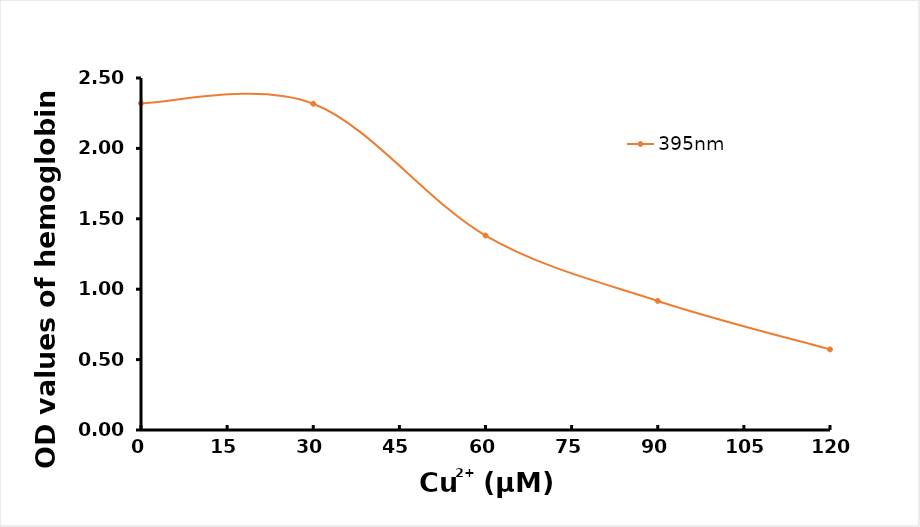
| Category | 395nm |
|---|---|
| 0.0 | 2.321 |
| 30.0 | 2.317 |
| 60.0 | 1.381 |
| 90.0 | 0.917 |
| 120.0 | 0.572 |